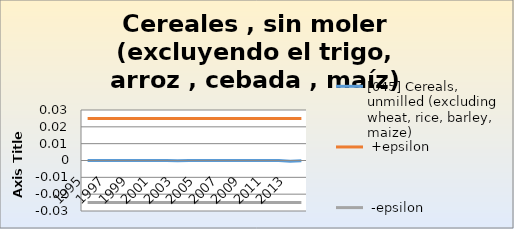
| Category | [045] Cereals, unmilled (excluding wheat, rice, barley, maize) |  +epsilon |  -epsilon |
|---|---|---|---|
| 1995.0 | 0 | 0.025 | -0.025 |
| 1996.0 | 0 | 0.025 | -0.025 |
| 1997.0 | 0 | 0.025 | -0.025 |
| 1998.0 | 0 | 0.025 | -0.025 |
| 1999.0 | 0 | 0.025 | -0.025 |
| 2000.0 | 0 | 0.025 | -0.025 |
| 2001.0 | 0 | 0.025 | -0.025 |
| 2002.0 | 0 | 0.025 | -0.025 |
| 2003.0 | 0 | 0.025 | -0.025 |
| 2004.0 | 0 | 0.025 | -0.025 |
| 2005.0 | 0 | 0.025 | -0.025 |
| 2006.0 | 0 | 0.025 | -0.025 |
| 2007.0 | 0 | 0.025 | -0.025 |
| 2008.0 | 0 | 0.025 | -0.025 |
| 2009.0 | 0 | 0.025 | -0.025 |
| 2010.0 | 0 | 0.025 | -0.025 |
| 2011.0 | 0 | 0.025 | -0.025 |
| 2012.0 | 0 | 0.025 | -0.025 |
| 2013.0 | 0 | 0.025 | -0.025 |
| 2014.0 | 0 | 0.025 | -0.025 |